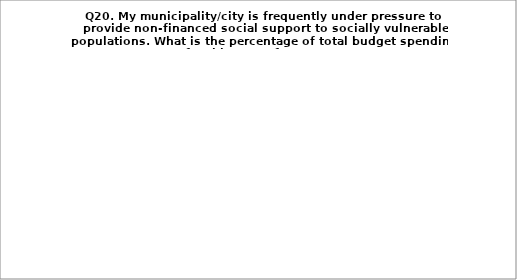
| Category | Series 0 |
|---|---|
| 2% | 46.552 |
| 3% | 18.966 |
| 5% | 13.793 |
| 7% and more  | 13.793 |
| My municipality/city has no such expenditures | 6.897 |